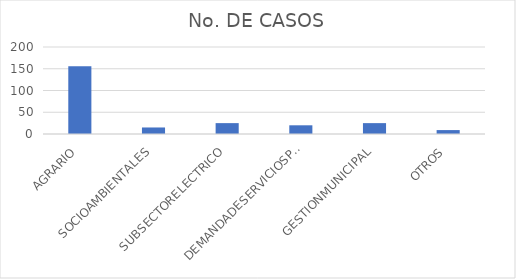
| Category | No. DE CASOS |
|---|---|
| AGRARIO | 156 |
| SOCIOAMBIENTALES | 15 |
| SUBSECTORELECTRICO | 25 |
| DEMANDADESERVICIOSPUBLICOS | 20 |
| GESTIONMUNICIPAL | 25 |
| OTROS | 9 |